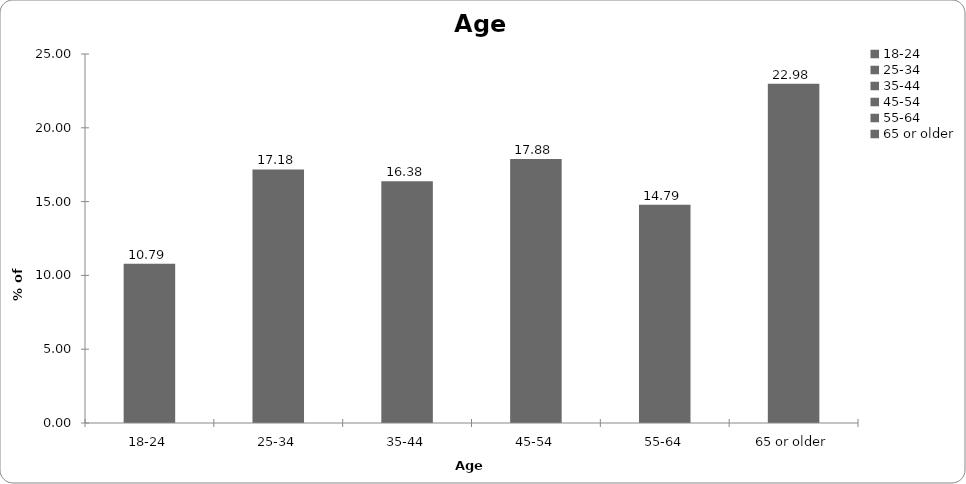
| Category | Age |
|---|---|
| 18-24 | 10.789 |
| 25-34 | 17.183 |
| 35-44 | 16.384 |
| 45-54 | 17.882 |
| 55-64 | 14.785 |
| 65 or older | 22.977 |